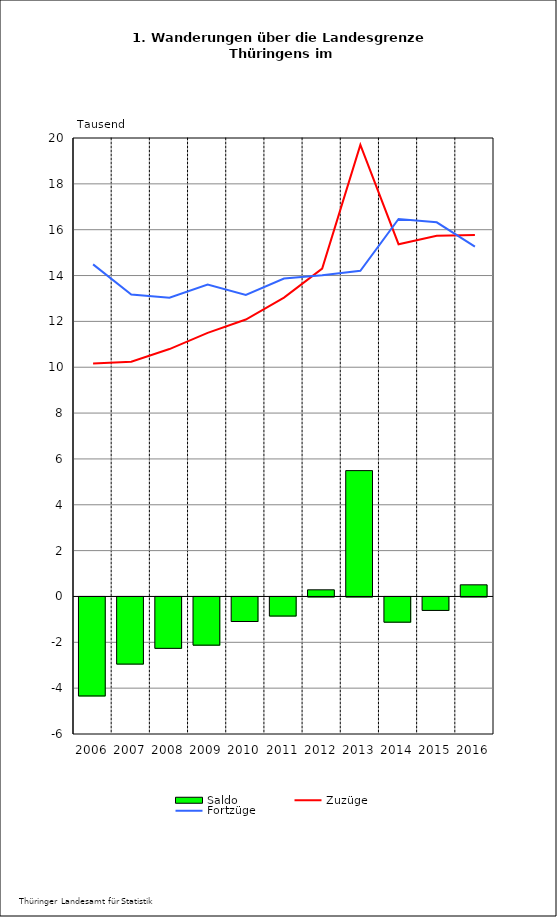
| Category | Saldo |
|---|---|
| 2006.0 | -4.319 |
| 2007.0 | -2.929 |
| 2008.0 | -2.242 |
| 2009.0 | -2.102 |
| 2010.0 | -1.071 |
| 2011.0 | -0.832 |
| 2012.0 | 0.29 |
| 2013.0 | 5.49 |
| 2014.0 | -1.1 |
| 2015.0 | -0.587 |
| 2016.0 | 0.508 |